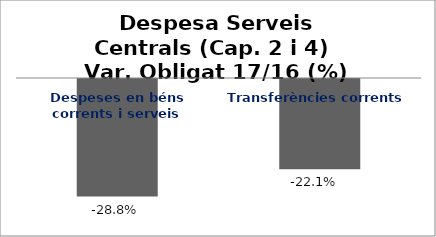
| Category | Series 0 |
|---|---|
| Despeses en béns corrents i serveis | -0.288 |
| Transferències corrents | -0.221 |